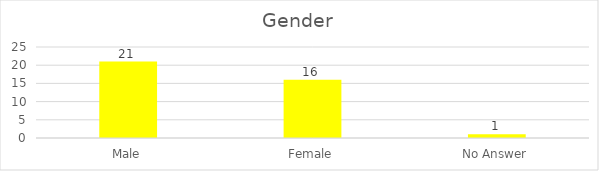
| Category | Gender |
|---|---|
| Male | 21 |
| Female | 16 |
| No Answer | 1 |